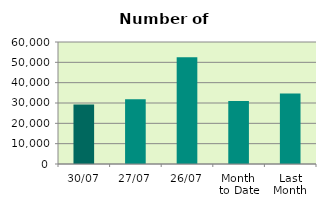
| Category | Series 0 |
|---|---|
| 30/07 | 29322 |
| 27/07 | 31846 |
| 26/07 | 52554 |
| Month 
to Date | 31004.571 |
| Last
Month | 34615.524 |